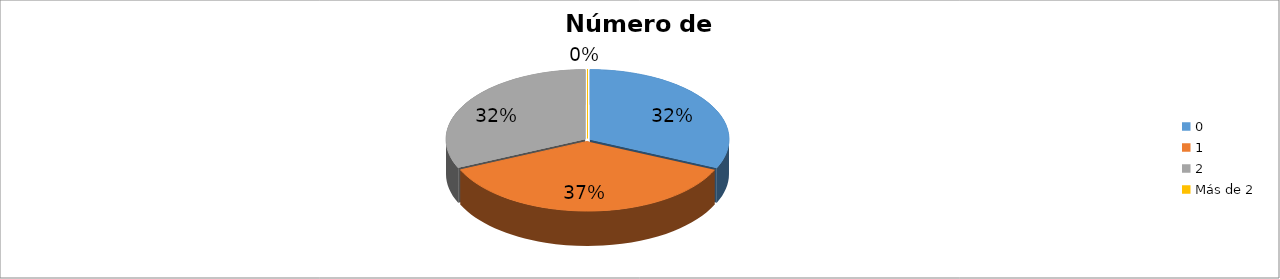
| Category | Series 0 |
|---|---|
| 0 | 0.317 |
| 1 | 0.366 |
| 2 | 0.317 |
| Más de 2 | 0 |